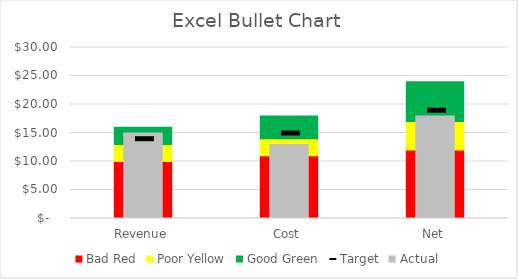
| Category | Bad Red | Poor Yellow | Good Green |
|---|---|---|---|
| Revenue | 10 | 3 | 3 |
| Cost | 11 | 3 | 4 |
| Net | 12 | 5 | 7 |